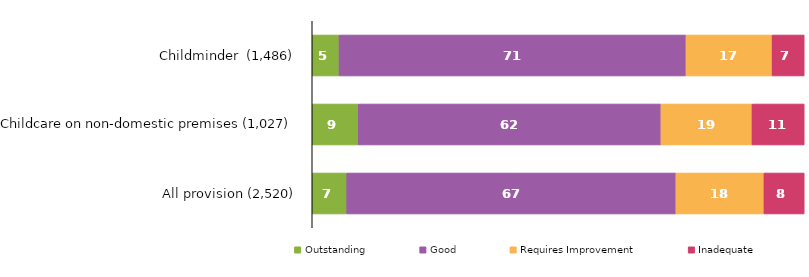
| Category | Outstanding | Good | Requires Improvement | Inadequate |
|---|---|---|---|---|
| Childminder  (1,486) | 5.451 | 70.525 | 17.497 | 6.528 |
| Childcare on non-domestic premises (1,027) | 9.348 | 61.538 | 18.5 | 10.613 |
| All provision (2,520) | 7.024 | 66.905 | 17.897 | 8.175 |